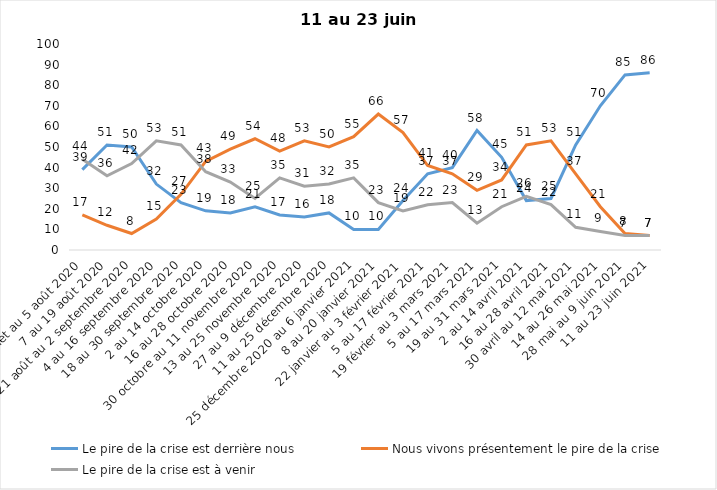
| Category | Le pire de la crise est derrière nous | Nous vivons présentement le pire de la crise | Le pire de la crise est à venir |
|---|---|---|---|
| 24 juillet au 5 août 2020 | 39 | 17 | 44 |
| 7 au 19 août 2020 | 51 | 12 | 36 |
| 21 août au 2 septembre 2020 | 50 | 8 | 42 |
| 4 au 16 septembre 2020 | 32 | 15 | 53 |
| 18 au 30 septembre 2020 | 23 | 27 | 51 |
| 2 au 14 octobre 2020 | 19 | 43 | 38 |
| 16 au 28 octobre 2020 | 18 | 49 | 33 |
| 30 octobre au 11 novembre 2020 | 21 | 54 | 25 |
| 13 au 25 novembre 2020 | 17 | 48 | 35 |
| 27 au 9 décembre 2020 | 16 | 53 | 31 |
| 11 au 25 décembre 2020 | 18 | 50 | 32 |
| 25 décembre 2020 au 6 janvier 2021 | 10 | 55 | 35 |
| 8 au 20 janvier 2021 | 10 | 66 | 23 |
| 22 janvier au 3 février 2021 | 24 | 57 | 19 |
| 5 au 17 février 2021 | 37 | 41 | 22 |
| 19 février au 3 mars 2021 | 40 | 37 | 23 |
| 5 au 17 mars 2021 | 58 | 29 | 13 |
| 19 au 31 mars 2021 | 45 | 34 | 21 |
| 2 au 14 avril 2021 | 24 | 51 | 26 |
| 16 au 28 avril 2021 | 25 | 53 | 22 |
| 30 avril au 12 mai 2021 | 51 | 37 | 11 |
| 14 au 26 mai 2021 | 70 | 21 | 9 |
| 28 mai au 9 juin 2021 | 85 | 8 | 7 |
| 11 au 23 juin 2021 | 86 | 7 | 7 |